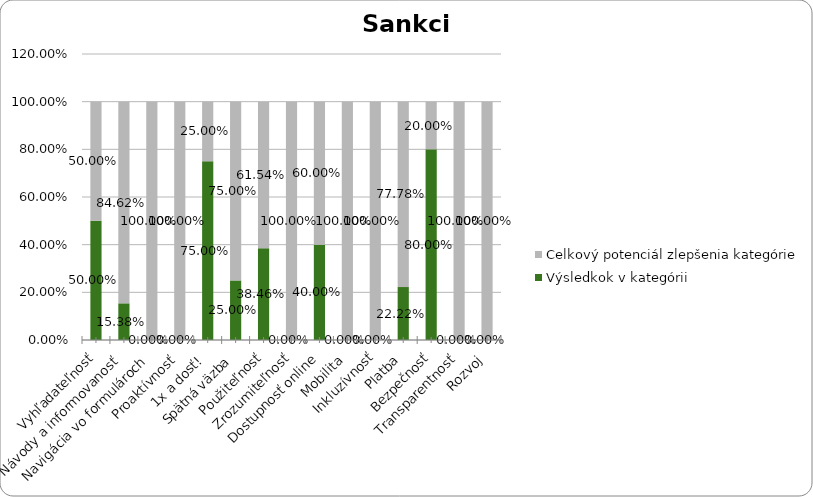
| Category | Výsledkok v kategórii | Celkový potenciál zlepšenia kategórie |
|---|---|---|
| Vyhľadateľnosť | 0.5 | 0.5 |
| Návody a informovanosť | 0.154 | 0.846 |
| Navigácia vo formulároch | 0 | 1 |
| Proaktívnosť | 0 | 1 |
| 1x a dosť! | 0.75 | 0.25 |
| Spätná väzba | 0.25 | 0.75 |
| Použiteľnosť | 0.385 | 0.615 |
| Zrozumiteľnosť | 0 | 1 |
| Dostupnosť online | 0.4 | 0.6 |
| Mobilita | 0 | 1 |
| Inkluzívnosť | 0 | 1 |
| Platba | 0.222 | 0.778 |
| Bezpečnosť | 0.8 | 0.2 |
| Transparentnosť | 0 | 1 |
| Rozvoj | 0 | 1 |